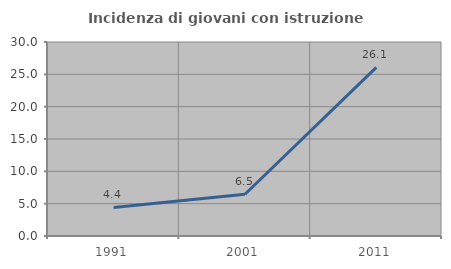
| Category | Incidenza di giovani con istruzione universitaria |
|---|---|
| 1991.0 | 4.412 |
| 2001.0 | 6.452 |
| 2011.0 | 26.087 |